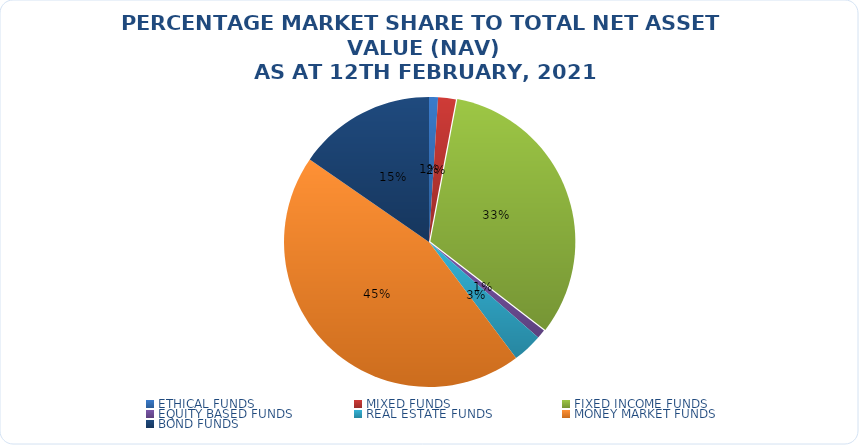
| Category | NET ASSET VALUE |
|---|---|
| ETHICAL FUNDS | 15028506577.94 |
| MIXED FUNDS | 29612293800.64 |
| FIXED INCOME FUNDS | 486718344326.016 |
| EQUITY BASED FUNDS | 14859567653.78 |
| REAL ESTATE FUNDS | 49918590305.391 |
| MONEY MARKET FUNDS | 673064205898.19 |
| BOND FUNDS | 230376946578.97 |